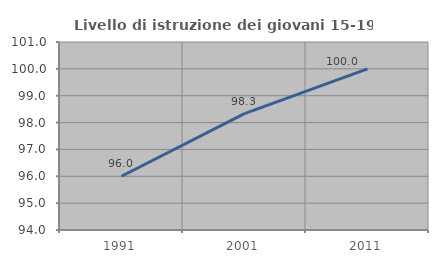
| Category | Livello di istruzione dei giovani 15-19 anni |
|---|---|
| 1991.0 | 96 |
| 2001.0 | 98.333 |
| 2011.0 | 100 |